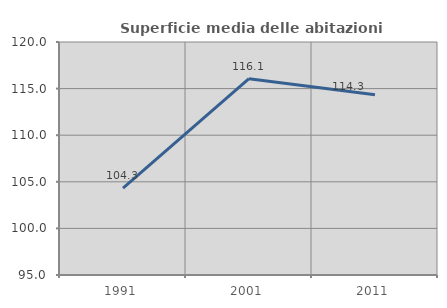
| Category | Superficie media delle abitazioni occupate |
|---|---|
| 1991.0 | 104.313 |
| 2001.0 | 116.064 |
| 2011.0 | 114.341 |